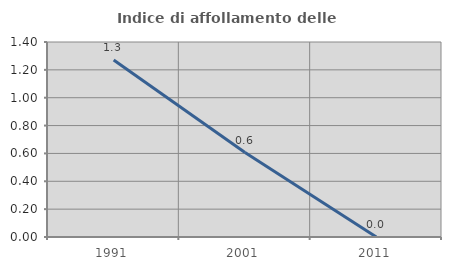
| Category | Indice di affollamento delle abitazioni  |
|---|---|
| 1991.0 | 1.27 |
| 2001.0 | 0.606 |
| 2011.0 | 0 |